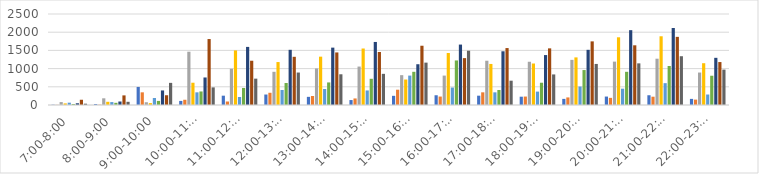
| Category | Series 0 | Series 1 | Series 2 | Series 3 | Series 4 | Series 5 | Series 6 | Series 7 | Series 8 |
|---|---|---|---|---|---|---|---|---|---|
| 7:00-8:00 | 8 | 4 | 80 | 44 | 64 | 28 | 48 | 144 | 36 |
| 8:00-9:00 | 28 | 8 | 184 | 88 | 80 | 60 | 96 | 264 | 88 |
| 9:00-10:00 | 496 | 348 | 76 | 52 | 192 | 112 | 400 | 268 | 608 |
| 10:00-11:00 | 112 | 144 | 1464 | 612 | 348 | 372 | 756 | 1812 | 484 |
| 11:00-12:00 | 256 | 96 | 996 | 1500 | 220 | 468 | 1596 | 1216 | 724 |
| 12:00-13:00 | 288 | 336 | 912 | 1180 | 412 | 604 | 1516 | 1324 | 892 |
| 13:00-14:00 | 224 | 248 | 1004 | 1328 | 440 | 620 | 1576 | 1444 | 844 |
| 14:00-15:00 | 136 | 180 | 1056 | 1552 | 400 | 720 | 1732 | 1456 | 856 |
| 15:00-16:00 | 252 | 420 | 820 | 700 | 808 | 912 | 1120 | 1628 | 1164 |
| 16:00-17:00 | 268 | 232 | 808 | 1428 | 480 | 1224 | 1660 | 1288 | 1492 |
| 17:00-18:00 | 256 | 348 | 1216 | 1128 | 348 | 412 | 1476 | 1564 | 668 |
| 18:00-19:00 | 228 | 232 | 1188 | 1140 | 368 | 612 | 1372 | 1556 | 840 |
| 19:00-20:00 | 168 | 208 | 1240 | 1308 | 508 | 960 | 1516 | 1748 | 1128 |
| 20:00-21:00 | 232 | 196 | 1192 | 1860 | 448 | 912 | 2056 | 1640 | 1144 |
| 21:00-22:00 | 268 | 228 | 1272 | 1888 | 600 | 1072 | 2116 | 1872 | 1340 |
| 22:00-23:00 | 168 | 148 | 892 | 1148 | 288 | 804 | 1296 | 1180 | 972 |